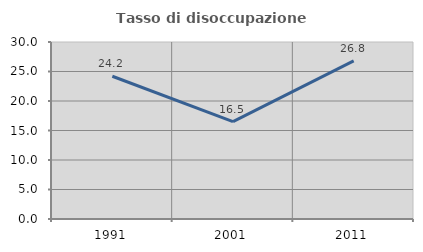
| Category | Tasso di disoccupazione giovanile  |
|---|---|
| 1991.0 | 24.191 |
| 2001.0 | 16.509 |
| 2011.0 | 26.81 |